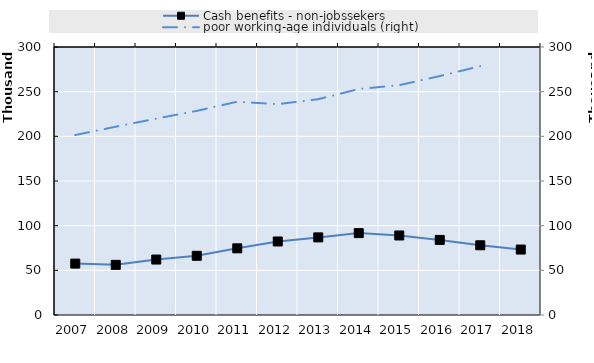
| Category | Cash benefits - non-jobssekers | 0 | Series 14 | Series 15 | Series 16 | Series 17 | Series 18 | Series 19 |
|---|---|---|---|---|---|---|---|---|
| 2007.0 | 57542 |  |  |  |  |  |  |  |
| 2008.0 | 56130.75 |  |  |  |  |  |  |  |
| 2009.0 | 62085.75 |  |  |  |  |  |  |  |
| 2010.0 | 66264 |  |  |  |  |  |  |  |
| 2011.0 | 74625.75 |  |  |  |  |  |  |  |
| 2012.0 | 82304.75 |  |  |  |  |  |  |  |
| 2013.0 | 86886.5 |  |  |  |  |  |  |  |
| 2014.0 | 91667.25 |  |  |  |  |  |  |  |
| 2015.0 | 89027 |  |  |  |  |  |  |  |
| 2016.0 | 84050 |  |  |  |  |  |  |  |
| 2017.0 | 78042 |  |  |  |  |  |  |  |
| 2018.0 | 73253 |  |  |  |  |  |  |  |